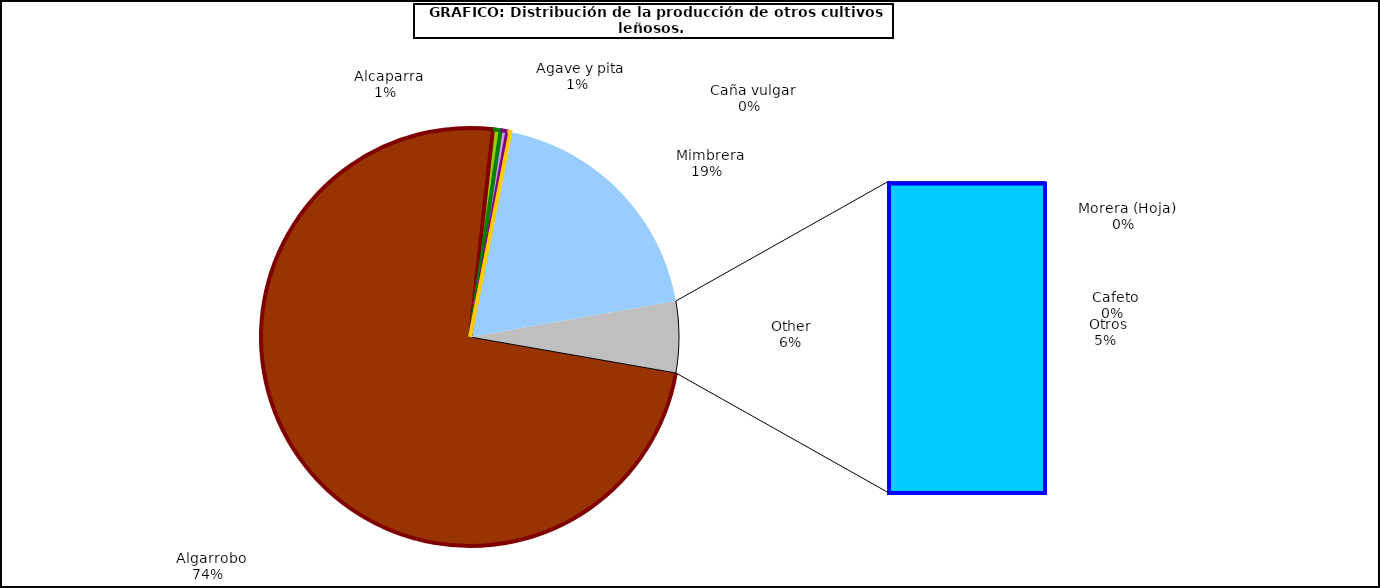
| Category | Series 0 |
|---|---|
|   Algarrobo | 39587 |
|   Alcaparra | 318 |
|   Agave y pita | 278 |
|   Caña vulgar | 124 |
|   Mimbrera | 10245 |
|   Cafeto | 12 |
|   Morera (Hoja) | 12 |
|   Otros | 2924 |